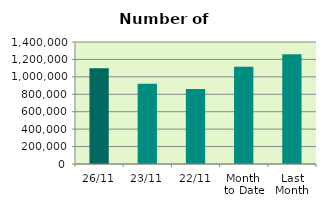
| Category | Series 0 |
|---|---|
| 26/11 | 1097594 |
| 23/11 | 919766 |
| 22/11 | 860694 |
| Month 
to Date | 1115366.889 |
| Last
Month | 1260789.391 |